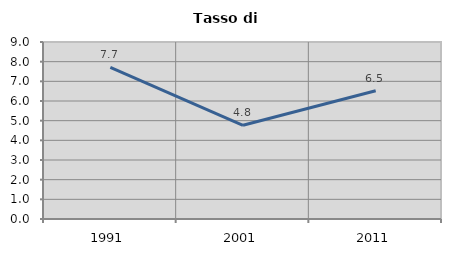
| Category | Tasso di disoccupazione   |
|---|---|
| 1991.0 | 7.706 |
| 2001.0 | 4.765 |
| 2011.0 | 6.523 |